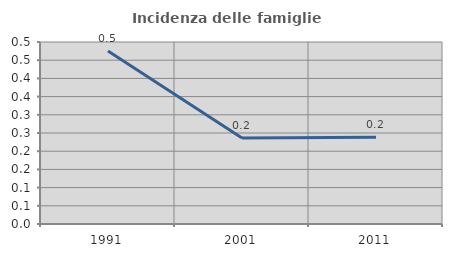
| Category | Incidenza delle famiglie numerose |
|---|---|
| 1991.0 | 0.475 |
| 2001.0 | 0.236 |
| 2011.0 | 0.238 |